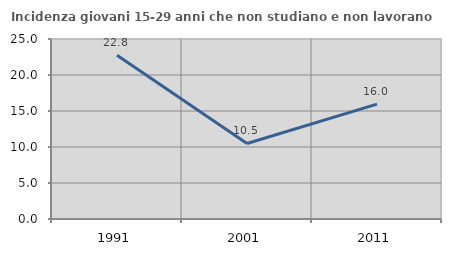
| Category | Incidenza giovani 15-29 anni che non studiano e non lavorano  |
|---|---|
| 1991.0 | 22.751 |
| 2001.0 | 10.494 |
| 2011.0 | 15.955 |